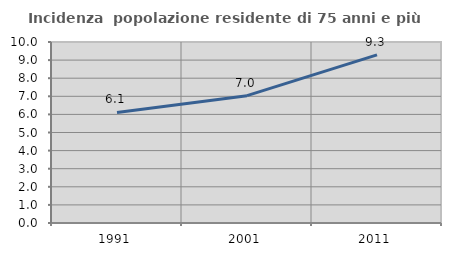
| Category | Incidenza  popolazione residente di 75 anni e più |
|---|---|
| 1991.0 | 6.109 |
| 2001.0 | 7.036 |
| 2011.0 | 9.289 |